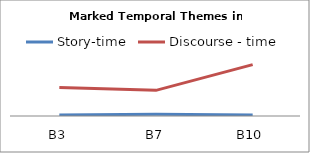
| Category | Story-time | Discourse - time |
|---|---|---|
| B3 | 1 | 31 |
| B7 | 2 | 28 |
| B10 | 1 | 56 |